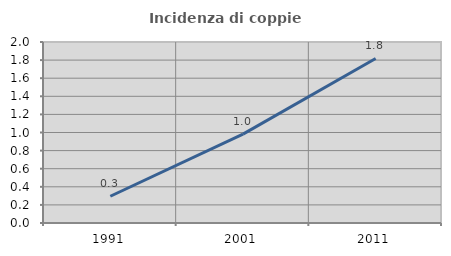
| Category | Incidenza di coppie miste |
|---|---|
| 1991.0 | 0.296 |
| 2001.0 | 0.982 |
| 2011.0 | 1.818 |